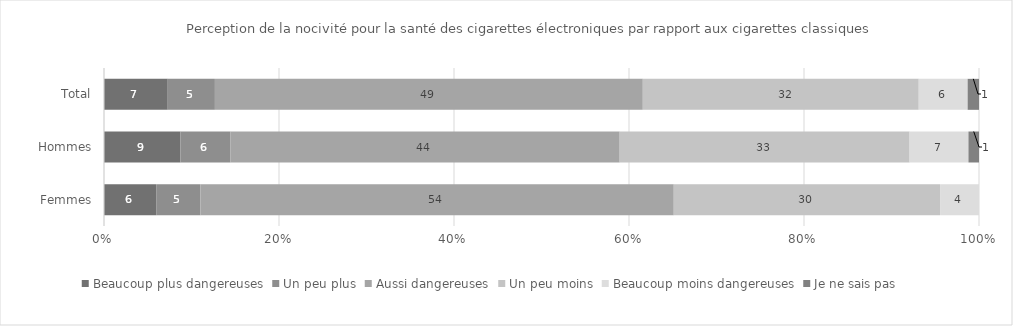
| Category | Beaucoup plus dangereuses | Un peu plus | Aussi dangereuses | Un peu moins | Beaucoup moins dangereuses | Je ne sais pas |
|---|---|---|---|---|---|---|
| Total | 7.3 | 5.4 | 49 | 31.6 | 5.6 | 1.3 |
| Hommes | 8.7 | 5.7 | 44.3 | 33 | 6.7 | 1.2 |
| Femmes | 5.9 | 5 | 53.5 | 30.1 | 4.4 | 0 |